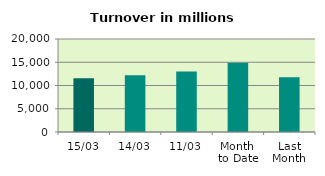
| Category | Series 0 |
|---|---|
| 15/03 | 11584.011 |
| 14/03 | 12189.994 |
| 11/03 | 13031.048 |
| Month 
to Date | 14908.272 |
| Last
Month | 11787.675 |